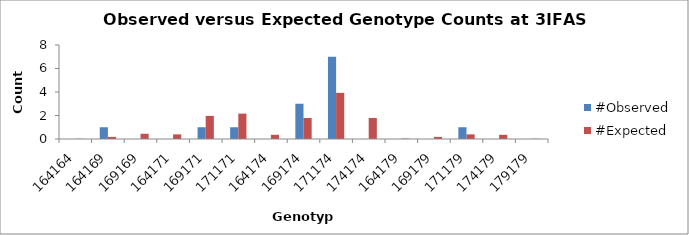
| Category | #Observed | #Expected |
|---|---|---|
| 164164.0 | 0 | 0.018 |
| 164169.0 | 1 | 0.179 |
| 169169.0 | 0 | 0.446 |
| 164171.0 | 0 | 0.393 |
| 169171.0 | 1 | 1.964 |
| 171171.0 | 1 | 2.161 |
| 164174.0 | 0 | 0.357 |
| 169174.0 | 3 | 1.786 |
| 171174.0 | 7 | 3.929 |
| 174174.0 | 0 | 1.786 |
| 164179.0 | 0 | 0.036 |
| 169179.0 | 0 | 0.179 |
| 171179.0 | 1 | 0.393 |
| 174179.0 | 0 | 0.357 |
| 179179.0 | 0 | 0.018 |